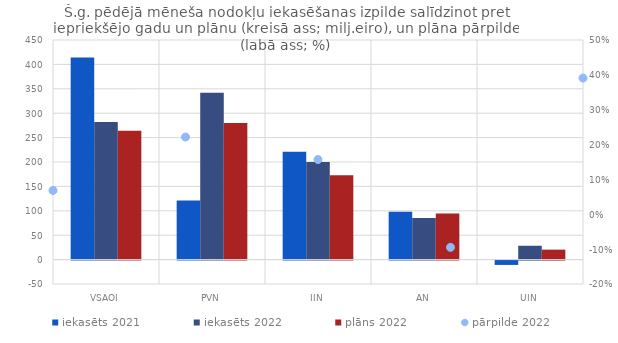
| Category | iekasēts 2021 | iekasēts 2022 | plāns 2022 |
|---|---|---|---|
| VSAOI | 414.233 | 282.163 | 264.07 |
| PVN | 120.891 | 342.088 | 280.041 |
| IIN | 220.865 | 199.898 | 172.77 |
| AN | 98.123 | 85.386 | 94.337 |
| UIN | -8.843 | 28.372 | 20.4 |